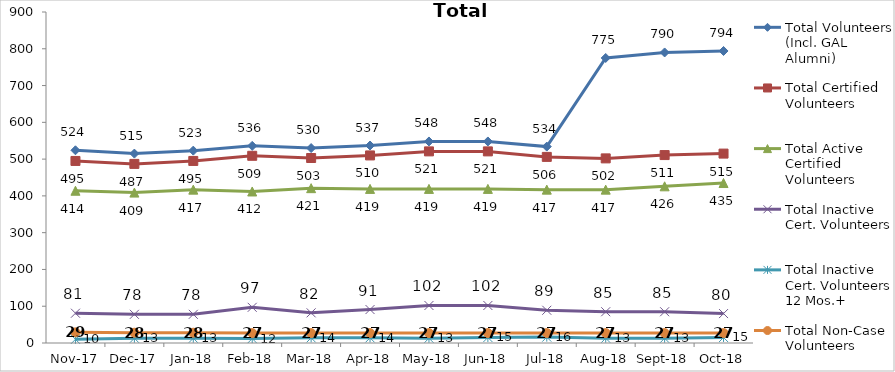
| Category | Total Volunteers (Incl. GAL Alumni) | Total Certified Volunteers | Total Active Certified Volunteers | Total Inactive Cert. Volunteers | Total Inactive Cert. Volunteers 12 Mos.+ | Total Non-Case Volunteers |
|---|---|---|---|---|---|---|
| 2017-11-01 | 524 | 495 | 414 | 81 | 10 | 29 |
| 2017-12-01 | 515 | 487 | 409 | 78 | 13 | 28 |
| 2018-01-01 | 523 | 495 | 417 | 78 | 13 | 28 |
| 2018-02-01 | 536 | 509 | 412 | 97 | 12 | 27 |
| 2018-03-01 | 530 | 503 | 421 | 82 | 14 | 27 |
| 2018-04-01 | 537 | 510 | 419 | 91 | 14 | 27 |
| 2018-05-01 | 548 | 521 | 419 | 102 | 13 | 27 |
| 2018-06-01 | 548 | 521 | 419 | 102 | 15 | 27 |
| 2018-07-01 | 534 | 506 | 417 | 89 | 16 | 27 |
| 2018-08-01 | 775 | 502 | 417 | 85 | 13 | 27 |
| 2018-09-01 | 790 | 511 | 426 | 85 | 13 | 27 |
| 2018-10-01 | 794 | 515 | 435 | 80 | 15 | 27 |